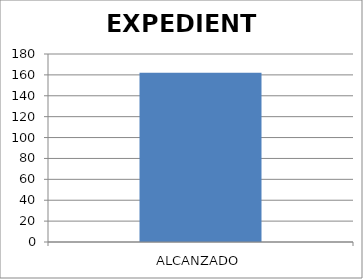
| Category | EXPEDIENTE |
|---|---|
| ALCANZADO | 162 |